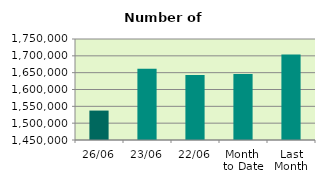
| Category | Series 0 |
|---|---|
| 26/06 | 1537390 |
| 23/06 | 1661946 |
| 22/06 | 1643152 |
| Month 
to Date | 1646040.111 |
| Last
Month | 1704183.545 |